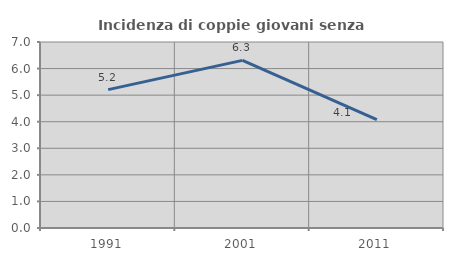
| Category | Incidenza di coppie giovani senza figli |
|---|---|
| 1991.0 | 5.207 |
| 2001.0 | 6.309 |
| 2011.0 | 4.083 |